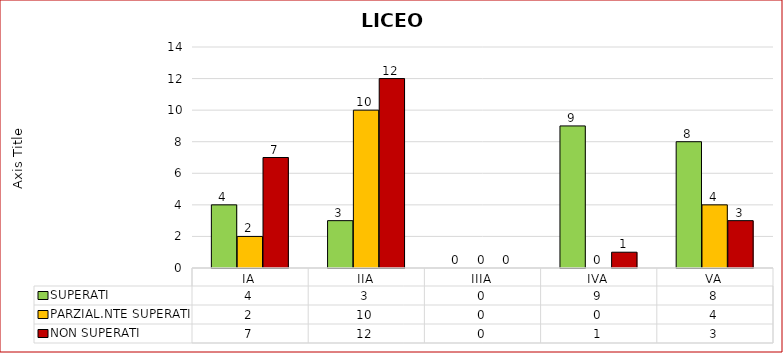
| Category | SUPERATI | PARZIAL.NTE SUPERATI | NON SUPERATI |
|---|---|---|---|
| IA | 4 | 2 | 7 |
| IIA | 3 | 10 | 12 |
| IIIA | 0 | 0 | 0 |
| IVA | 9 | 0 | 1 |
| VA | 8 | 4 | 3 |